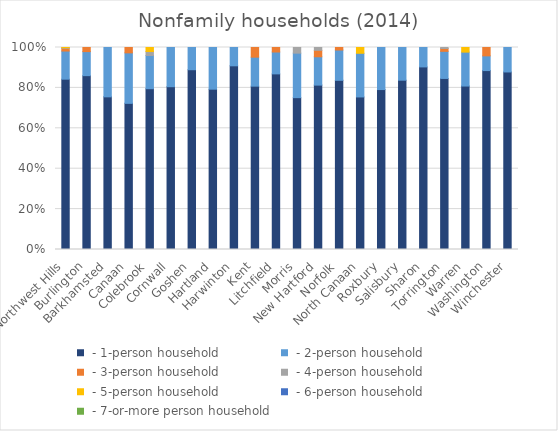
| Category |  - 1-person household |  - 2-person household |  - 3-person household |  - 4-person household |  - 5-person household |  - 6-person household |  - 7-or-more person household |
|---|---|---|---|---|---|---|---|
| Northwest Hills | 13021 | 2150 | 203 | 51 | 17 | 0 | 0 |
| Burlington | 593 | 82 | 14 | 0 | 0 | 0 | 0 |
| Barkhamsted | 399 | 129 | 0 | 0 | 0 | 0 | 0 |
| Canaan | 191 | 66 | 7 | 0 | 0 | 0 | 0 |
| Colebrook | 121 | 25 | 0 | 3 | 3 | 0 | 0 |
| Cornwall | 162 | 39 | 0 | 0 | 0 | 0 | 0 |
| Goshen | 259 | 32 | 0 | 0 | 0 | 0 | 0 |
| Hartland | 100 | 26 | 0 | 0 | 0 | 0 | 0 |
| Harwinton | 341 | 34 | 0 | 0 | 0 | 0 | 0 |
| Kent | 355 | 63 | 21 | 0 | 0 | 0 | 0 |
| Litchfield | 1052 | 131 | 27 | 0 | 0 | 0 | 0 |
| Morris | 215 | 63 | 0 | 8 | 0 | 0 | 0 |
| New Hartford | 638 | 110 | 25 | 11 | 0 | 0 | 0 |
| Norfolk | 201 | 36 | 3 | 0 | 0 | 0 | 0 |
| North Canaan | 290 | 83 | 0 | 0 | 11 | 0 | 0 |
| Roxbury | 232 | 61 | 0 | 0 | 0 | 0 | 0 |
| Salisbury | 383 | 74 | 0 | 0 | 0 | 0 | 0 |
| Sharon | 461 | 49 | 0 | 0 | 0 | 0 | 0 |
| Torrington | 4899 | 776 | 81 | 29 | 0 | 0 | 0 |
| Warren | 106 | 22 | 0 | 0 | 3 | 0 | 0 |
| Washington | 535 | 44 | 25 | 0 | 0 | 0 | 0 |
| Winchester | 1488 | 205 | 0 | 0 | 0 | 0 | 0 |